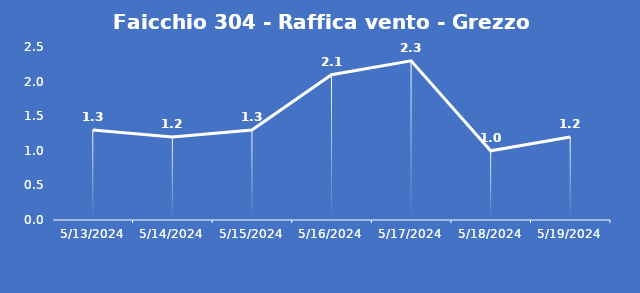
| Category | Faicchio 304 - Raffica vento - Grezzo (m/s) |
|---|---|
| 5/13/24 | 1.3 |
| 5/14/24 | 1.2 |
| 5/15/24 | 1.3 |
| 5/16/24 | 2.1 |
| 5/17/24 | 2.3 |
| 5/18/24 | 1 |
| 5/19/24 | 1.2 |